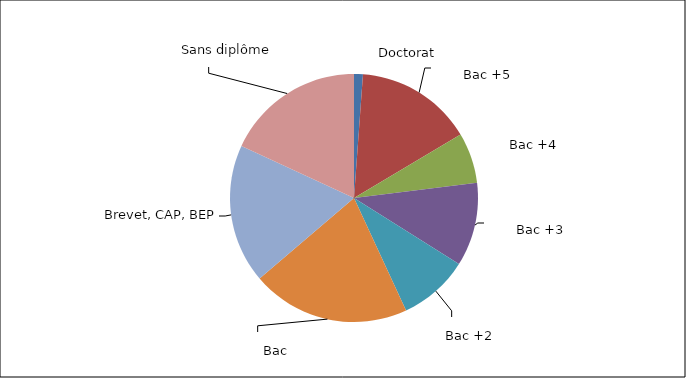
| Category | Series 0 |
|---|---|
| 0 | 0.012 |
| 1 | 0.153 |
| 2 | 0.066 |
| 3 | 0.109 |
| 4 | 0.092 |
| 5 | 0.207 |
| 6 | 0.181 |
| 7 | 0.181 |